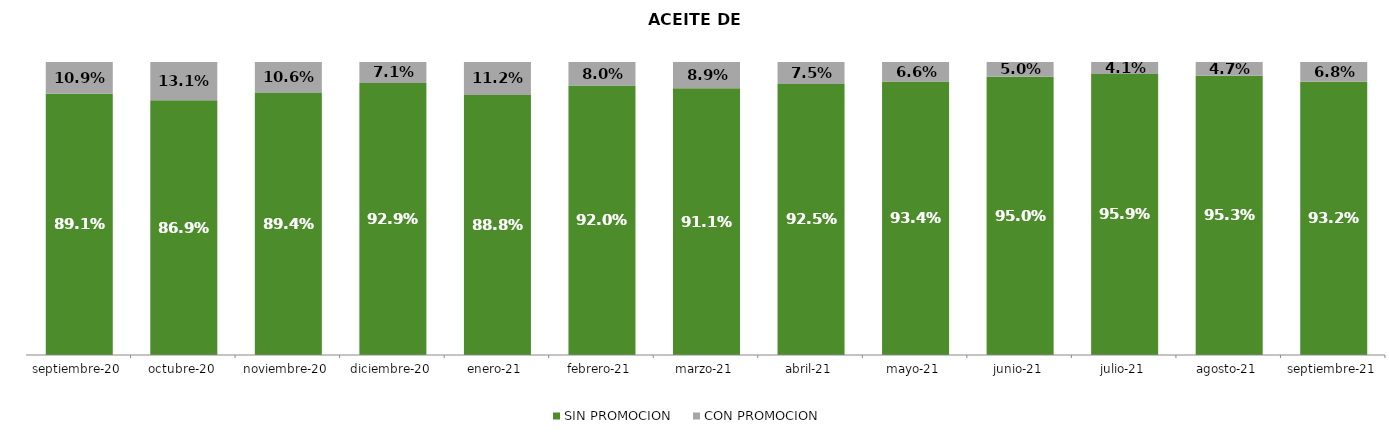
| Category | SIN PROMOCION   | CON PROMOCION   |
|---|---|---|
| 2020-09-01 | 0.891 | 0.109 |
| 2020-10-01 | 0.869 | 0.131 |
| 2020-11-01 | 0.894 | 0.106 |
| 2020-12-01 | 0.929 | 0.071 |
| 2021-01-01 | 0.888 | 0.112 |
| 2021-02-01 | 0.92 | 0.08 |
| 2021-03-01 | 0.911 | 0.089 |
| 2021-04-01 | 0.925 | 0.075 |
| 2021-05-01 | 0.934 | 0.066 |
| 2021-06-01 | 0.95 | 0.05 |
| 2021-07-01 | 0.959 | 0.041 |
| 2021-08-01 | 0.953 | 0.047 |
| 2021-09-01 | 0.932 | 0.068 |